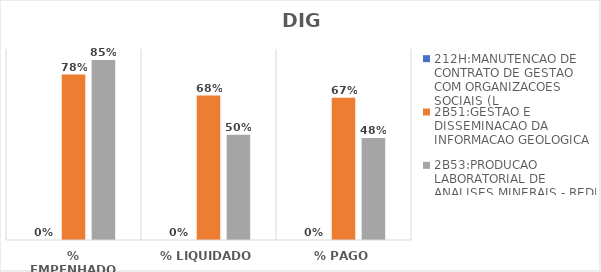
| Category | 212H:MANUTENCAO DE CONTRATO DE GESTAO COM ORGANIZACOES SOCIAIS (L | 2B51:GESTAO E DISSEMINACAO DA INFORMACAO GEOLOGICA | 2B53:PRODUCAO LABORATORIAL DE ANALISES MINERAIS - REDE LAMIN |
|---|---|---|---|
| % EMPENHADO | 0 | 0.779 | 0.848 |
| % LIQUIDADO | 0 | 0.681 | 0.496 |
| % PAGO | 0 | 0.67 | 0.481 |